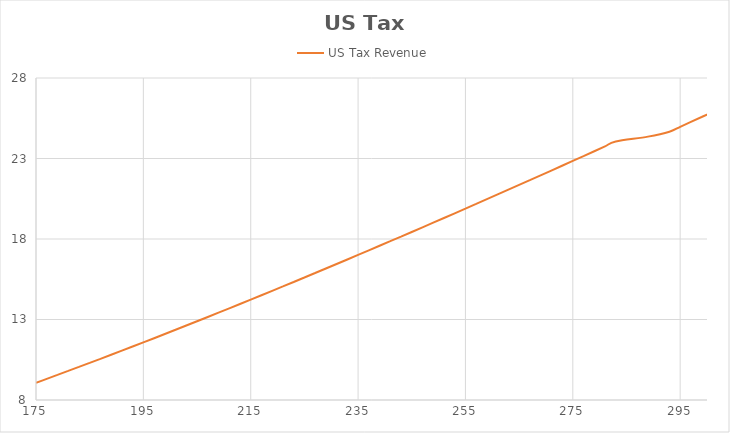
| Category | US Tax Revenue |
|---|---|
| 175.0 | 9.069 |
| 177.0 | 9.313 |
| 179.0 | 9.558 |
| 181.0 | 9.805 |
| 183.0 | 10.054 |
| 185.0 | 10.304 |
| 187.0 | 10.556 |
| 189.0 | 10.81 |
| 191.0 | 11.065 |
| 193.0 | 11.321 |
| 195.0 | 11.579 |
| 197.0 | 11.839 |
| 199.0 | 12.1 |
| 201.0 | 12.362 |
| 203.0 | 12.626 |
| 205.0 | 12.89 |
| 207.0 | 13.157 |
| 209.0 | 13.424 |
| 211.0 | 13.693 |
| 213.0 | 13.963 |
| 215.0 | 14.235 |
| 217.0 | 14.507 |
| 219.0 | 14.781 |
| 221.0 | 15.056 |
| 223.0 | 15.332 |
| 225.0 | 15.609 |
| 227.0 | 15.887 |
| 229.0 | 16.166 |
| 231.0 | 16.447 |
| 233.0 | 16.728 |
| 235.0 | 17.011 |
| 237.0 | 17.294 |
| 239.0 | 17.578 |
| 241.0 | 17.864 |
| 243.0 | 18.15 |
| 245.0 | 18.437 |
| 247.0 | 18.726 |
| 249.0 | 19.015 |
| 251.0 | 19.305 |
| 253.0 | 19.595 |
| 255.0 | 19.887 |
| 257.0 | 20.18 |
| 259.0 | 20.473 |
| 261.0 | 20.767 |
| 263.0 | 21.063 |
| 265.0 | 21.358 |
| 267.0 | 21.655 |
| 269.0 | 21.952 |
| 271.0 | 22.251 |
| 273.0 | 22.549 |
| 275.0 | 22.849 |
| 277.0 | 23.149 |
| 279.0 | 23.45 |
| 281.0 | 23.752 |
| 283.0 | 24.055 |
| 289.0 | 24.358 |
| 293.0 | 24.662 |
| 295.0 | 24.966 |
| 297.0 | 25.271 |
| 299.0 | 25.577 |
| 301.0 | 25.883 |
| 303.0 | 26.19 |
| 309.0 | 26.498 |